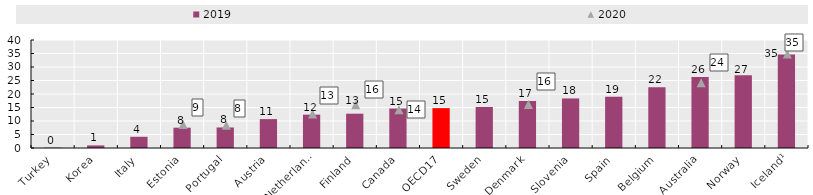
| Category | 2019 |
|---|---|
| Turkey | 0.125 |
| Korea | 0.958 |
| Italy | 4.15 |
| Estonia | 7.515 |
| Portugal | 7.605 |
| Austria | 10.704 |
| Netherlands | 12.353 |
| Finland | 12.71 |
| Canada | 14.625 |
| OECD17 | 14.766 |
| Sweden | 15.177 |
| Denmark | 17.4 |
| Slovenia | 18.352 |
| Spain | 18.999 |
| Belgium | 22.482 |
| Australia | 26.33 |
| Norway | 26.937 |
| Iceland¹ | 34.597 |